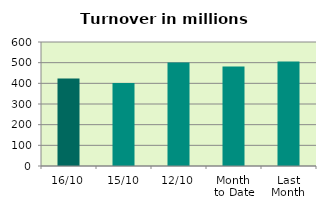
| Category | Series 0 |
|---|---|
| 16/10 | 422.808 |
| 15/10 | 401.923 |
| 12/10 | 500.355 |
| Month 
to Date | 481.64 |
| Last
Month | 505.274 |